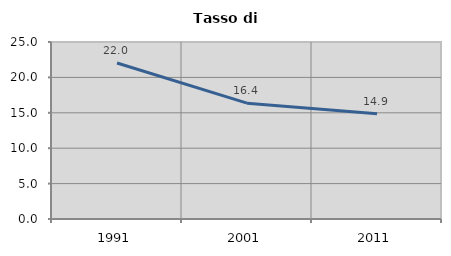
| Category | Tasso di disoccupazione   |
|---|---|
| 1991.0 | 22.037 |
| 2001.0 | 16.364 |
| 2011.0 | 14.877 |